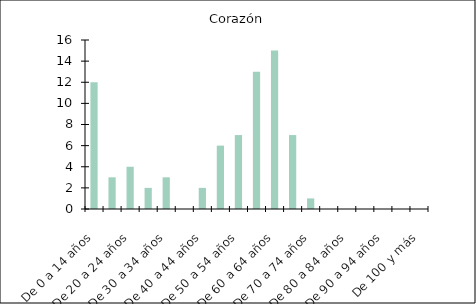
| Category | Corazón |
|---|---|
| De 0 a 14 años | 12 |
| De 15 a 19 años | 3 |
| De 20 a 24 años | 4 |
| De 25 a 29 años | 2 |
| De 30 a 34 años | 3 |
| De 35 a 39 años | 0 |
| De 40 a 44 años | 2 |
| De 45 a 49 años | 6 |
| De 50 a 54 años | 7 |
| De 55 a 59 años | 13 |
| De 60 a 64 años | 15 |
| De 65 a 69 años | 7 |
| De 70 a 74 años | 1 |
| De 75 a 79 años | 0 |
| De 80 a 84 años | 0 |
| De 85 a 89 años | 0 |
| De 90 a 94 años | 0 |
| De 95 a 99 años | 0 |
| De 100 y más | 0 |